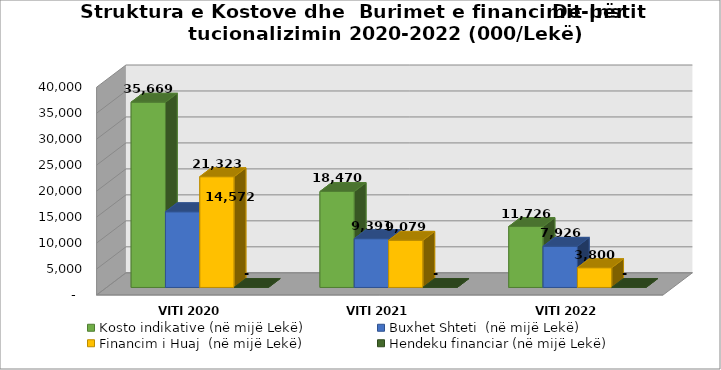
| Category | Kosto indikative (në mijë Lekë) | Buxhet Shteti  (në mijë Lekë) | Financim i Huaj  (në mijë Lekë) | Hendeku financiar (në mijë Lekë) |
|---|---|---|---|---|
| VITI 2020 | 35668.5 | 14571.5 | 21323 | 0 |
| VITI 2021 | 18469.5 | 9390.5 | 9079 | 0 |
| VITI 2022 | 11726 | 7926 | 3800 | 0 |